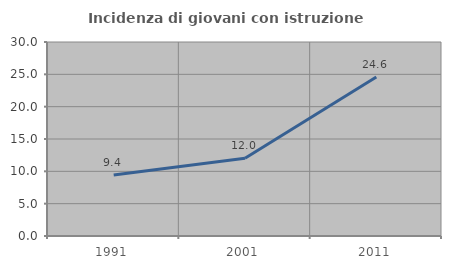
| Category | Incidenza di giovani con istruzione universitaria |
|---|---|
| 1991.0 | 9.439 |
| 2001.0 | 12.01 |
| 2011.0 | 24.597 |